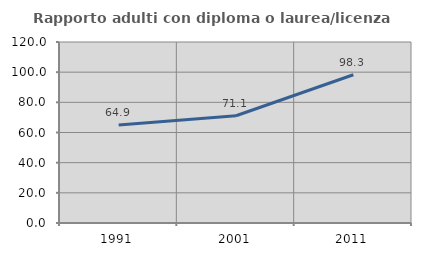
| Category | Rapporto adulti con diploma o laurea/licenza media  |
|---|---|
| 1991.0 | 64.904 |
| 2001.0 | 71.096 |
| 2011.0 | 98.311 |